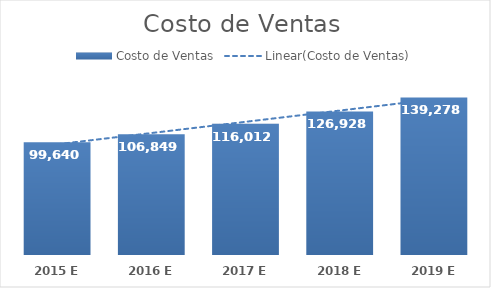
| Category | Costo de Ventas |
|---|---|
| 2015 E | 99639.682 |
| 2016 E | 106848.776 |
| 2017 E | 116012.385 |
| 2018 E | 126927.896 |
| 2019 E | 139277.819 |